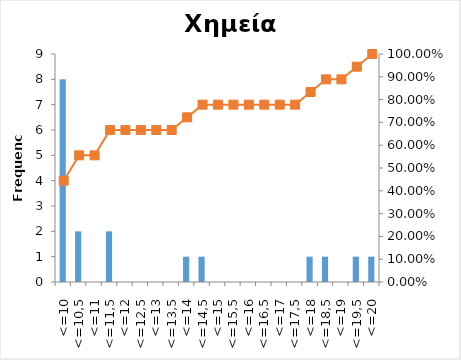
| Category | Series 0 |
|---|---|
| <=10 | 8 |
| <=10,5 | 2 |
| <=11 | 0 |
| <=11,5 | 2 |
| <=12 | 0 |
| <=12,5 | 0 |
| <=13 | 0 |
| <=13,5 | 0 |
| <=14 | 1 |
| <=14,5 | 1 |
| <=15 | 0 |
| <=15,5 | 0 |
| <=16 | 0 |
| <=16,5 | 0 |
| <=17 | 0 |
| <=17,5 | 0 |
| <=18 | 1 |
| <=18,5 | 1 |
| <=19 | 0 |
| <=19,5 | 1 |
| <=20 | 1 |